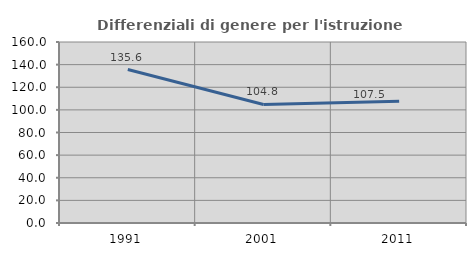
| Category | Differenziali di genere per l'istruzione superiore |
|---|---|
| 1991.0 | 135.625 |
| 2001.0 | 104.764 |
| 2011.0 | 107.522 |